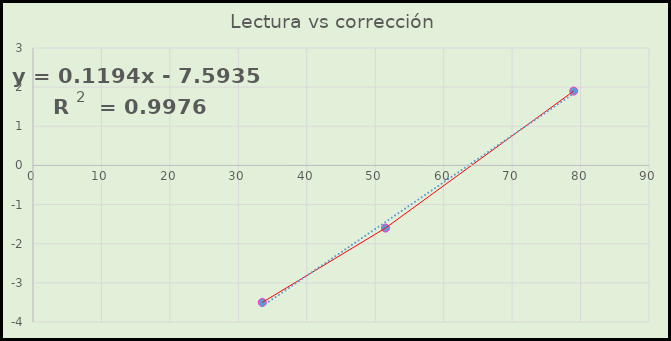
| Category | Corrección %hr |
|---|---|
| 33.5 | -3.5 |
| 51.5 | -1.6 |
| 79.0 | 1.9 |